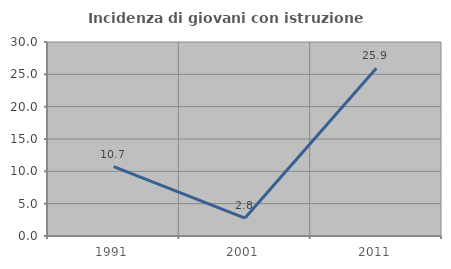
| Category | Incidenza di giovani con istruzione universitaria |
|---|---|
| 1991.0 | 10.714 |
| 2001.0 | 2.778 |
| 2011.0 | 25.926 |